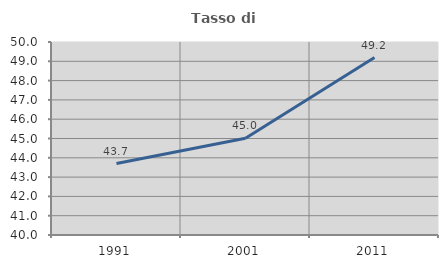
| Category | Tasso di occupazione   |
|---|---|
| 1991.0 | 43.703 |
| 2001.0 | 45.008 |
| 2011.0 | 49.193 |